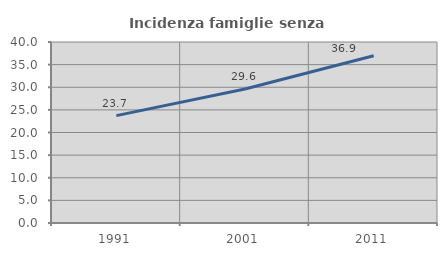
| Category | Incidenza famiglie senza nuclei |
|---|---|
| 1991.0 | 23.735 |
| 2001.0 | 29.626 |
| 2011.0 | 36.948 |